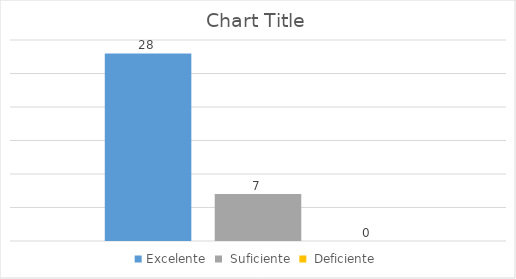
| Category | Excelente | Series 1 |  Suficiente |  Deficiente |
|---|---|---|---|---|
| 0.0 | 28 |  | 7 | 0 |